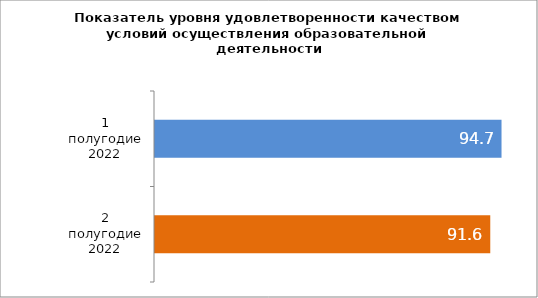
| Category | 1 полугодие 2022 2 полугодие 2022 |
|---|---|
| 1 полугодие 2022 | 94.679 |
| 2 полугодие 2022 | 91.603 |